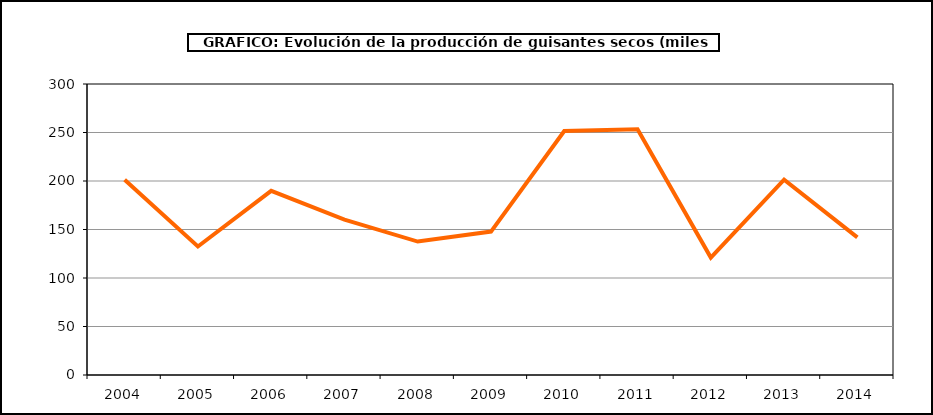
| Category | Producción |
|---|---|
| 2004.0 | 201.206 |
| 2005.0 | 132.5 |
| 2006.0 | 189.819 |
| 2007.0 | 160.207 |
| 2008.0 | 137.567 |
| 2009.0 | 147.87 |
| 2010.0 | 251.575 |
| 2011.0 | 253.427 |
| 2012.0 | 121.017 |
| 2013.0 | 201.326 |
| 2014.0 | 141.855 |